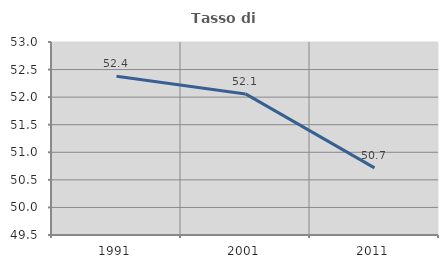
| Category | Tasso di occupazione   |
|---|---|
| 1991.0 | 52.38 |
| 2001.0 | 52.059 |
| 2011.0 | 50.717 |